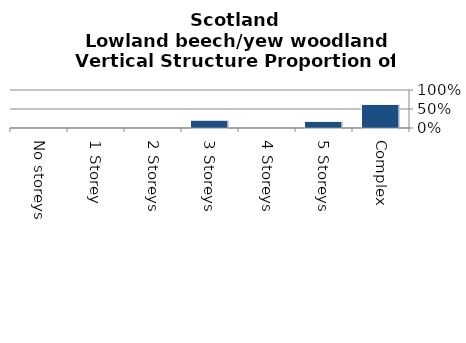
| Category | Lowland beech/yew woodland |
|---|---|
| No storeys | 0 |
| 1 Storey | 0 |
| 2 Storeys | 0 |
| 3 Storeys | 0.205 |
| 4 Storeys | 0 |
| 5 Storeys | 0.174 |
| Complex | 0.621 |